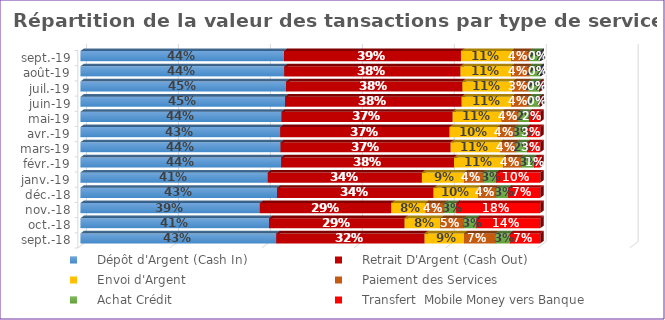
| Category |     Dépôt d'Argent (Cash In) |     Retrait D'Argent (Cash Out)  |     Envoi d'Argent  |     Réception d'Argent |     Paiement des Services |     Achat Crédit |     Transfert Banque vers Mobile Money |     Transfert  Mobile Money vers Banque  |
|---|---|---|---|---|---|---|---|---|
| 2018-09-01 | 0.426 | 0.323 | 0.086 | 0 | 0.068 | 0.031 | 0 | 0.066 |
| 2018-10-01 | 0.41 | 0.295 | 0.078 | 0 | 0.051 | 0.027 | 0 | 0.138 |
| 2018-11-01 | 0.39 | 0.286 | 0.075 | 0 | 0.041 | 0.025 | 0 | 0.183 |
| 2018-12-01 | 0.428 | 0.341 | 0.097 | 0 | 0.039 | 0.026 | 0 | 0.069 |
| 2019-01-01 | 0.407 | 0.336 | 0.091 | 0 | 0.042 | 0.028 | 0 | 0.095 |
| 2019-02-01 | 0.437 | 0.376 | 0.107 | 0 | 0.038 | 0.028 | 0 | 0.013 |
| 2019-03-01 | 0.435 | 0.37 | 0.108 | 0 | 0.035 | 0.024 | 0 | 0.028 |
| 2019-04-01 | 0.435 | 0.369 | 0.104 | 0 | 0.037 | 0.027 | 0 | 0.029 |
| 2019-05-01 | 0.437 | 0.372 | 0.107 | 0 | 0.037 | 0.023 | 0 | 0.023 |
| 2019-06-01 | 0.445 | 0.384 | 0.109 | 0 | 0.037 | 0.024 | 0 | 0.001 |
| 2019-07-01 | 0.447 | 0.383 | 0.109 | 0 | 0.035 | 0.023 | 0 | 0.002 |
| 2019-08-01 | 0.443 | 0.383 | 0.11 | 0 | 0.039 | 0.024 | 0 | 0 |
| 2019-09-01 | 0.443 | 0.385 | 0.11 | 0 | 0.039 | 0.023 | 0 | 0 |